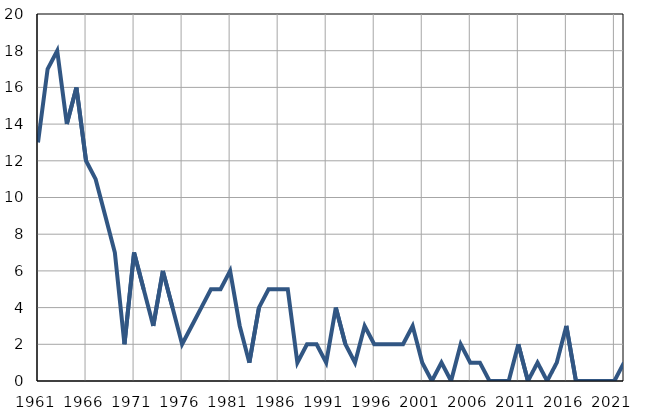
| Category | Infants
deaths |
|---|---|
| 1961.0 | 13 |
| 1962.0 | 17 |
| 1963.0 | 18 |
| 1964.0 | 14 |
| 1965.0 | 16 |
| 1966.0 | 12 |
| 1967.0 | 11 |
| 1968.0 | 9 |
| 1969.0 | 7 |
| 1970.0 | 2 |
| 1971.0 | 7 |
| 1972.0 | 5 |
| 1973.0 | 3 |
| 1974.0 | 6 |
| 1975.0 | 4 |
| 1976.0 | 2 |
| 1977.0 | 3 |
| 1978.0 | 4 |
| 1979.0 | 5 |
| 1980.0 | 5 |
| 1981.0 | 6 |
| 1982.0 | 3 |
| 1983.0 | 1 |
| 1984.0 | 4 |
| 1985.0 | 5 |
| 1986.0 | 5 |
| 1987.0 | 5 |
| 1988.0 | 1 |
| 1989.0 | 2 |
| 1990.0 | 2 |
| 1991.0 | 1 |
| 1992.0 | 4 |
| 1993.0 | 2 |
| 1994.0 | 1 |
| 1995.0 | 3 |
| 1996.0 | 2 |
| 1997.0 | 2 |
| 1998.0 | 2 |
| 1999.0 | 2 |
| 2000.0 | 3 |
| 2001.0 | 1 |
| 2002.0 | 0 |
| 2003.0 | 1 |
| 2004.0 | 0 |
| 2005.0 | 2 |
| 2006.0 | 1 |
| 2007.0 | 1 |
| 2008.0 | 0 |
| 2009.0 | 0 |
| 2010.0 | 0 |
| 2011.0 | 2 |
| 2012.0 | 0 |
| 2013.0 | 1 |
| 2014.0 | 0 |
| 2015.0 | 1 |
| 2016.0 | 3 |
| 2017.0 | 0 |
| 2018.0 | 0 |
| 2019.0 | 0 |
| 2020.0 | 0 |
| 2021.0 | 0 |
| 2022.0 | 1 |